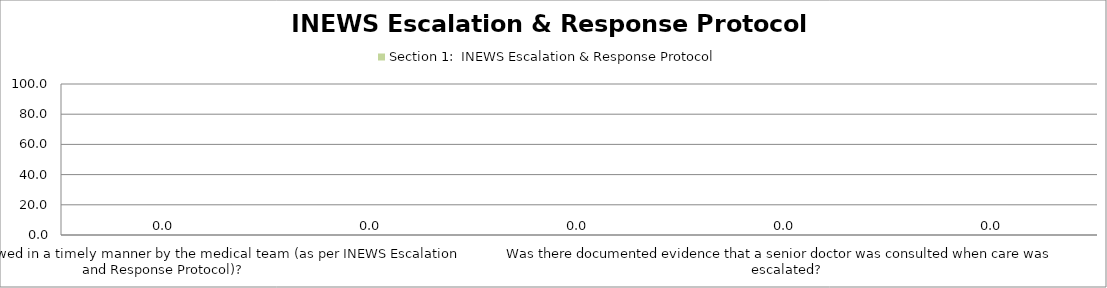
| Category | Section 1:  INEWS Escalation & Response Protocol |
|---|---|
| Was the patient reviewed in a timely manner by the medical team (as per INEWS Escalation and Response Protocol)? | 0 |
| Was there documented evidence of medical response to requested action or review? | 0 |
| Did the Doctor formulate and document a post review plan of care? | 0 |
| Was there documented evidence that a senior doctor was consulted when care was escalated? | 0 |
| Was there documented evidence that the SHO consulted with a Registrar if no response to treatment? | 0 |